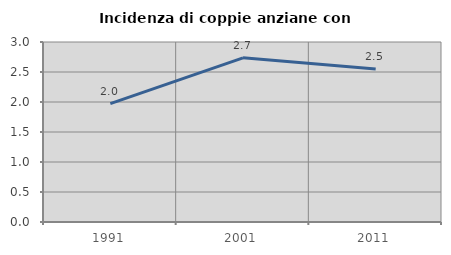
| Category | Incidenza di coppie anziane con figli |
|---|---|
| 1991.0 | 1.974 |
| 2001.0 | 2.736 |
| 2011.0 | 2.55 |